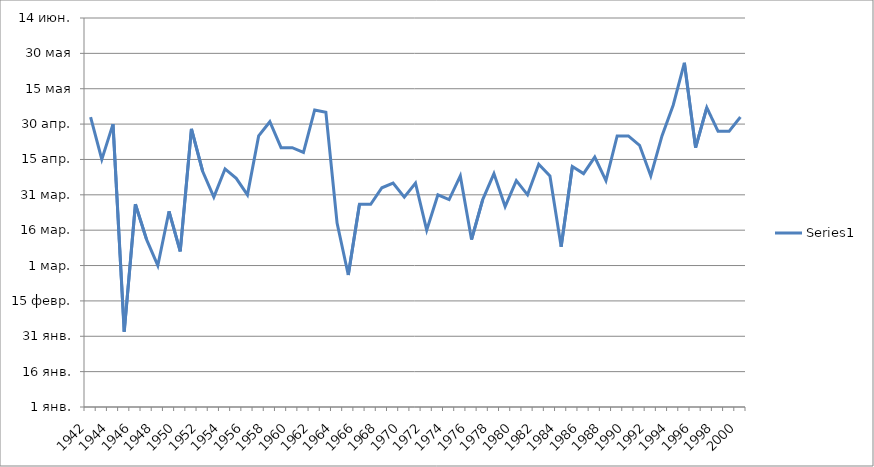
| Category | Series 0 |
|---|---|
| 1942.0 | 124 |
| 1943.0 | 106 |
| 1944.0 | 121 |
| 1945.0 | 33 |
| 1946.0 | 87 |
| 1947.0 | 72 |
| 1948.0 | 61 |
| 1949.0 | 84 |
| 1950.0 | 67 |
| 1951.0 | 119 |
| 1952.0 | 101 |
| 1953.0 | 90 |
| 1954.0 | 102 |
| 1955.0 | 98 |
| 1956.0 | 91 |
| 1957.0 | 116 |
| 1958.0 | 122 |
| 1959.0 | 111 |
| 1960.0 | 111 |
| 1961.0 | 109 |
| 1962.0 | 127 |
| 1963.0 | 126 |
| 1964.0 | 79 |
| 1965.0 | 57 |
| 1966.0 | 87 |
| 1967.0 | 87 |
| 1968.0 | 94 |
| 1969.0 | 96 |
| 1970.0 | 90 |
| 1971.0 | 96 |
| 1972.0 | 76 |
| 1973.0 | 91 |
| 1974.0 | 89 |
| 1975.0 | 99 |
| 1976.0 | 72 |
| 1977.0 | 89 |
| 1978.0 | 100 |
| 1979.0 | 86 |
| 1980.0 | 97 |
| 1981.0 | 91 |
| 1982.0 | 104 |
| 1983.0 | 99 |
| 1984.0 | 69 |
| 1985.0 | 103 |
| 1986.0 | 100 |
| 1987.0 | 107 |
| 1988.0 | 97 |
| 1989.0 | 116 |
| 1990.0 | 116 |
| 1991.0 | 112 |
| 1992.0 | 99 |
| 1993.0 | 116 |
| 1994.0 | 129 |
| 1995.0 | 147 |
| 1996.0 | 111 |
| 1997.0 | 128 |
| 1998.0 | 118 |
| 1999.0 | 118 |
| 2000.0 | 124 |